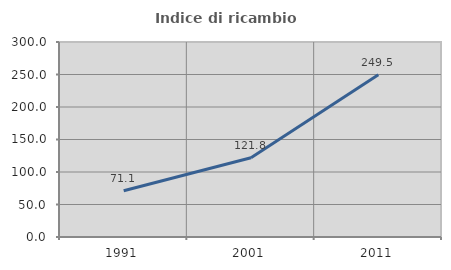
| Category | Indice di ricambio occupazionale  |
|---|---|
| 1991.0 | 71.131 |
| 2001.0 | 121.818 |
| 2011.0 | 249.462 |